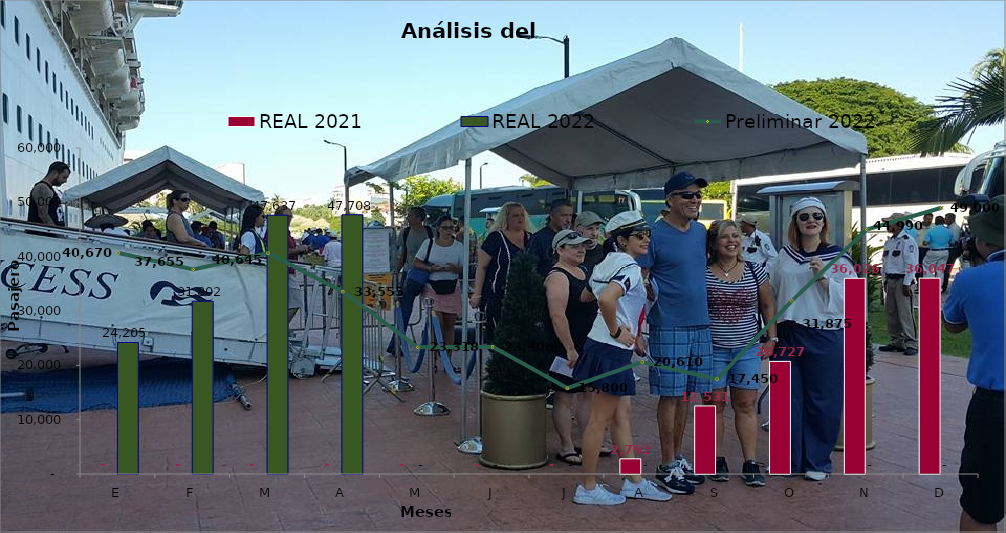
| Category | REAL 2021 | REAL 2022 |
|---|---|---|
| E | 0 | 24205 |
| F | 0 | 31802 |
| M | 0 | 47637 |
| A | 0 | 47708 |
| M | 0 | 0 |
| J | 0 | 0 |
| J | 0 | 0 |
| A | 2792 | 0 |
| S | 12531 | 0 |
| O | 20727 | 0 |
| N | 36026 | 0 |
| D | 36047 | 0 |